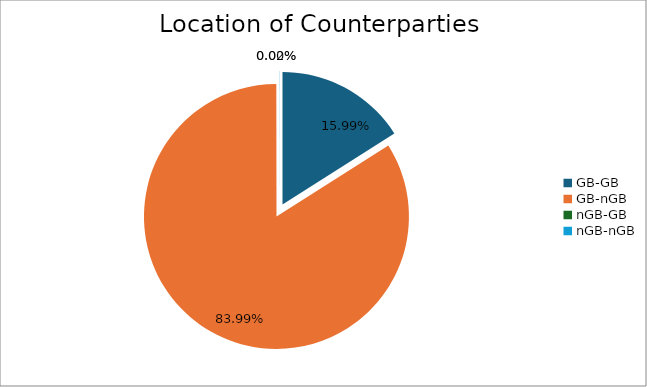
| Category | Series 0 |
|---|---|
| GB-GB | 1765729.683 |
| GB-nGB | 9273865.33 |
| nGB-GB | 0 |
| nGB-nGB | 2379.11 |